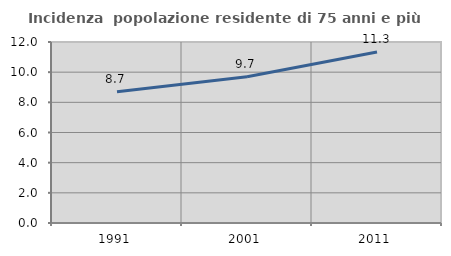
| Category | Incidenza  popolazione residente di 75 anni e più |
|---|---|
| 1991.0 | 8.704 |
| 2001.0 | 9.701 |
| 2011.0 | 11.331 |